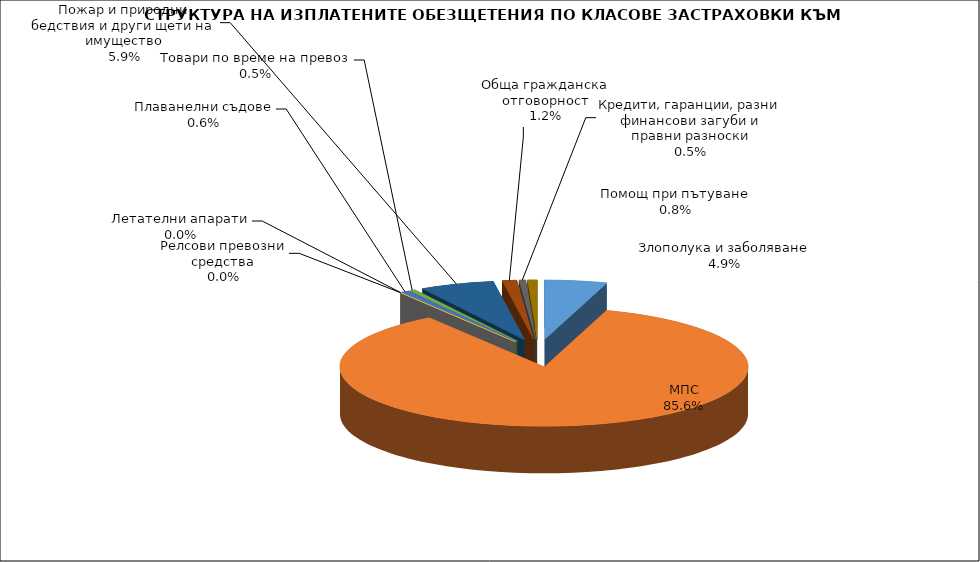
| Category | Series 0 |
|---|---|
| Злополука и заболяване | 0.049 |
| МПС | 0.856 |
| Релсови превозни средства | 0 |
| Летателни апарати | 0 |
| Плаванелни съдове | 0.006 |
| Товари по време на превоз | 0.005 |
| Пожар и природни бедствия и други щети на имущество | 0.059 |
| Обща гражданска отговорност | 0.012 |
| Кредити, гаранции, разни финансови загуби и правни разноски | 0.005 |
| Помощ при пътуване | 0.008 |